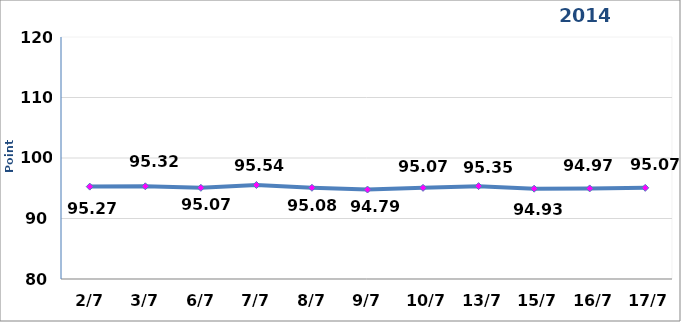
| Category | 2014 |
|---|---|
|  2/7 | 95.27 |
|  3/7 | 95.32 |
|  6/7 | 95.07 |
|  7/7 | 95.54 |
|  8/7 | 95.08 |
|  9/7 | 94.79 |
|  10/7 | 95.07 |
|  13/7 | 95.35 |
|  15/7 | 94.93 |
|  16/7 | 94.97 |
|  17/7 | 95.07 |